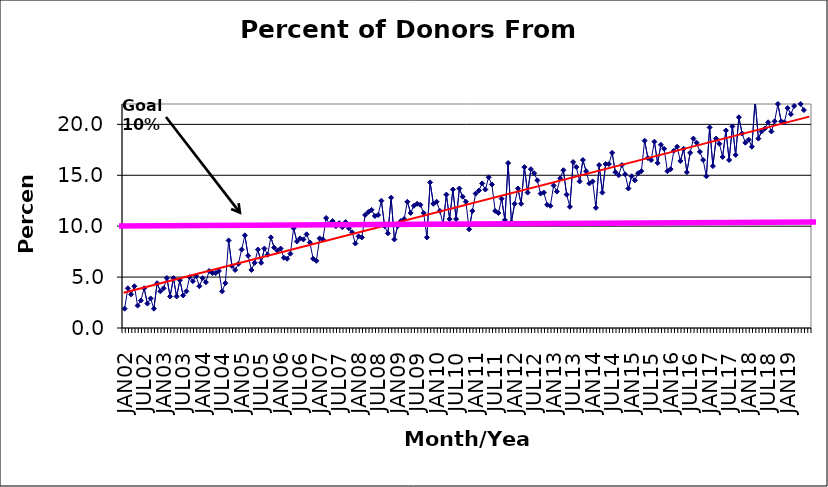
| Category | Series 0 |
|---|---|
| JAN02 | 1.9 |
| FEB02 | 3.9 |
| MAR02 | 3.3 |
| APR02 | 4.1 |
| MAY02 | 2.2 |
| JUN02 | 2.7 |
| JUL02 | 3.9 |
| AUG02 | 2.4 |
| SEP02 | 2.9 |
| OCT02 | 1.9 |
| NOV02 | 4.4 |
| DEC02 | 3.6 |
| JAN03 | 3.9 |
| FEB03 | 4.9 |
| MAR03 | 3.1 |
| APR03 | 4.9 |
| MAY03 | 3.1 |
| JUN03 | 4.7 |
| JUL03 | 3.2 |
| AUG03 | 3.6 |
| SEP03 | 5 |
| OCT03 | 4.6 |
| NOV03 | 5.1 |
| DEC03 | 4.1 |
| JAN04 | 4.9 |
| FEB04 | 4.5 |
| MAR04 | 5.6 |
| APR04 | 5.4 |
| MAY04 | 5.4 |
| JUN04 | 5.6 |
| JUL04 | 3.6 |
| AUG04 | 4.4 |
| SEP04 | 8.6 |
| OCT04 | 6.1 |
| NOV04 | 5.7 |
| DEC04 | 6.3 |
| JAN05 | 7.7 |
| FEB05 | 9.1 |
| MAR05 | 7.1 |
| APR05 | 5.7 |
| MAY05 | 6.4 |
| JUN05 | 7.7 |
| JUL05 | 6.4 |
| AUG05 | 7.8 |
| SEP05 | 7.2 |
| OCT05 | 8.9 |
| NOV05 | 7.9 |
| DEC05 | 7.6 |
| JAN06 | 7.8 |
| FEB06 | 6.9 |
| MAR06 | 6.8 |
| APR06 | 7.3 |
| MAY06 | 9.8 |
| JUN06 | 8.5 |
| JUL06 | 8.8 |
| AUG06 | 8.7 |
| SEP06 | 9.2 |
| OCT06 | 8.4 |
| NOV06 | 6.8 |
| DEC06 | 6.6 |
| JAN07 | 8.8 |
| FEB07 | 8.7 |
| MAR07 | 10.8 |
| APR07 | 10.2 |
| MAY07 | 10.5 |
| JUN07 | 10 |
| JUL07 | 10.3 |
| AUG07 | 9.9 |
| SEP07 | 10.4 |
| OCT07 | 9.8 |
| NOV07 | 9.4 |
| DEC07 | 8.3 |
| JAN08 | 9 |
| FEB08 | 8.9 |
| MAR08 | 11.1 |
| APR08 | 11.4 |
| MAY08 | 11.6 |
| JUN08 | 11 |
| JUL08 | 11.1 |
| AUG08 | 12.5 |
| SEP08 | 10 |
| OCT08 | 9.3 |
| NOV08 | 12.8 |
| DEC08 | 8.7 |
| JAN09 | 10 |
| FEB09 | 10.5 |
| MAR09 | 10.7 |
| APR09 | 12.4 |
| MAY09 | 11.3 |
| JUN09 | 12 |
| JUL09 | 12.2 |
| AUG09 | 12.1 |
| SEP09 | 11.3 |
| OCT09 | 8.9 |
| NOV09 | 14.3 |
| DEC09 | 12.2 |
| JAN10 | 12.4 |
| FEB10 | 11.5 |
| MAR10 | 10.2 |
| APR10 | 13.1 |
| MAY10 | 10.7 |
| JUN10 | 13.6 |
| JUL10 | 10.7 |
| AUG10 | 13.7 |
| SEP10 | 12.9 |
| OCT10 | 12.4 |
| NOV10 | 9.7 |
| DEC10 | 11.5 |
| JAN11 | 13.2 |
| FEB11 | 13.5 |
| MAR11 | 14.2 |
| APR11 | 13.6 |
| MAY11 | 14.8 |
| JUN11 | 14.1 |
| JUL11 | 11.5 |
| AUG11 | 11.3 |
| SEP11 | 12.7 |
| OCT11 | 10.6 |
| NOV11 | 16.2 |
| DEC11 | 10.4 |
| JAN12 | 12.2 |
| FEB12 | 13.7 |
| MAR12 | 12.2 |
| APR12 | 15.8 |
| MAY12 | 13.3 |
| JUN12 | 15.6 |
| JUL12 | 15.2 |
| AUG12 | 14.5 |
| SEP12 | 13.2 |
| OCT12 | 13.3 |
| NOV12 | 12.1 |
| DEC12 | 12 |
| JAN13 | 14 |
| FEB13 | 13.4 |
| MAR13 | 14.7 |
| APR13 | 15.5 |
| MAY13 | 13.1 |
| JUN13 | 11.9 |
| JUL13 | 16.3 |
| AUG13 | 15.8 |
| SEP13 | 14.4 |
| OCT13 | 16.5 |
| NOV13 | 15.4 |
| DEC13 | 14.2 |
| JAN14 | 14.4 |
| FEB14 | 11.8 |
| MAR14 | 16 |
| APR14 | 13.3 |
| MAY14 | 16.1 |
| JUN14 | 16.1 |
| JUL14 | 17.2 |
| AUG14 | 15.3 |
| SEP14 | 15 |
| OCT14 | 16 |
| NOV14 | 15.1 |
| DEC14 | 13.7 |
| JAN15 | 14.9 |
| FEB15 | 14.5 |
| MAR15 | 15.2 |
| APR15 | 15.4 |
| MAY15 | 18.4 |
| JUN15 | 16.7 |
| JUL15 | 16.5 |
| AUG15 | 18.3 |
| SEP15 | 16.2 |
| OCT15 | 18 |
| NOV15 | 17.6 |
| DEC15 | 15.4 |
| JAN16 | 15.6 |
| FEB16 | 17.4 |
| MAR16 | 17.8 |
| APR16 | 16.4 |
| MAY16 | 17.6 |
| JUN16 | 15.3 |
| JUL16 | 17.2 |
| AUG16 | 18.6 |
| SEP16 | 18.2 |
| OCT16 | 17.3 |
| NOV16 | 16.5 |
| DEC16 | 14.9 |
| JAN17 | 19.7 |
| FEB17 | 15.9 |
| MAR17 | 18.6 |
| APR17 | 18.1 |
| MAY17 | 16.8 |
| JUN17 | 19.4 |
| JUL17 | 16.5 |
| AUG17 | 19.8 |
| SEP17 | 17 |
| OCT17 | 20.7 |
| NOV17 | 19.1 |
| DEC17 | 18.2 |
| JAN18 | 18.5 |
| FEB18 | 17.8 |
| MAR18 | 22.4 |
| APR18 | 18.6 |
| MAY18 | 19.3 |
| JUN18 | 19.6 |
| JUL18 | 20.2 |
| AUG18 | 19.3 |
| SEP18 | 20.3 |
| OCT18 | 22 |
| NOV18 | 20.3 |
| DEC18 | 20.2 |
| JAN19 | 21.6 |
| FEB19 | 21 |
| MAR19 | 21.8 |
| APR19 | 22.2 |
| MAY19 | 22 |
| JUN19 | 21.4 |